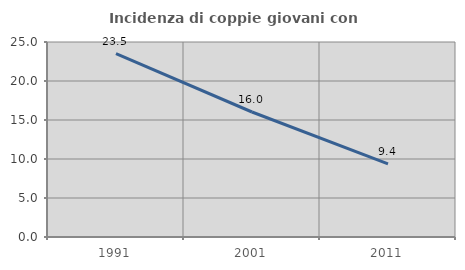
| Category | Incidenza di coppie giovani con figli |
|---|---|
| 1991.0 | 23.506 |
| 2001.0 | 16.026 |
| 2011.0 | 9.375 |